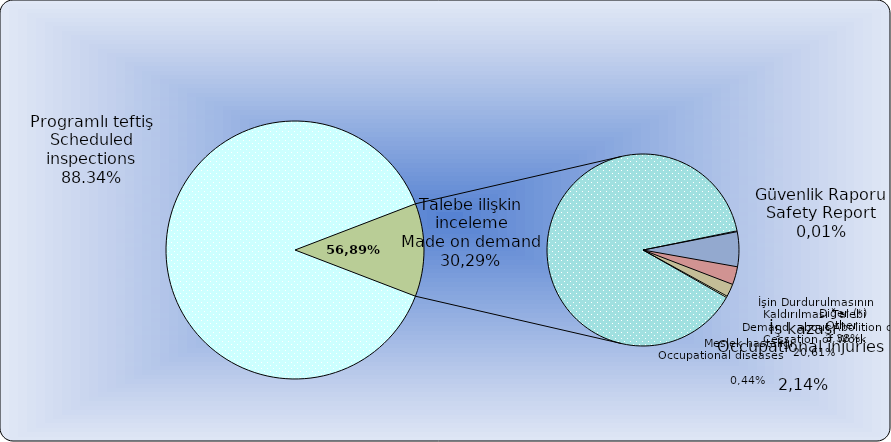
| Category | Series 0 |
|---|---|
| Programlı teftiş
Scheduled inspections | 15761 |
| İş kazası
Occupational injuries                 | 45 |
| Meslek hastalığı
Occupational diseases                              | 5 |
| Talebe ilişkin inceleme
Made on demand | 1843 |
| Çalışma yasağı
Employment restrictions | 0 |
| Güvenlik Raporu
Safety Report | 3 |
| İşin Durdurulmasının Kaldırılması Talebi 
 Demand  about Abolition of Cessation of Work  | 122 |
| Diğer (*)
Other | 63 |